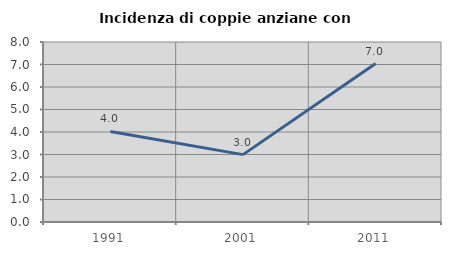
| Category | Incidenza di coppie anziane con figli |
|---|---|
| 1991.0 | 4.023 |
| 2001.0 | 2.994 |
| 2011.0 | 7.042 |